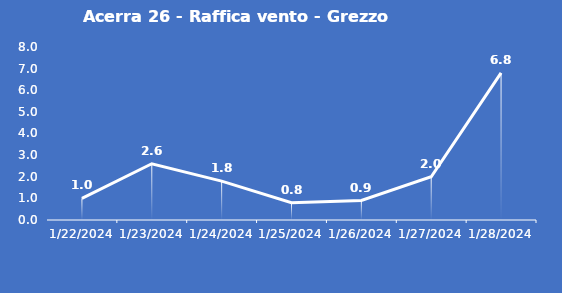
| Category | Acerra 26 - Raffica vento - Grezzo (m/s) |
|---|---|
| 1/22/24 | 1 |
| 1/23/24 | 2.6 |
| 1/24/24 | 1.8 |
| 1/25/24 | 0.8 |
| 1/26/24 | 0.9 |
| 1/27/24 | 2 |
| 1/28/24 | 6.8 |